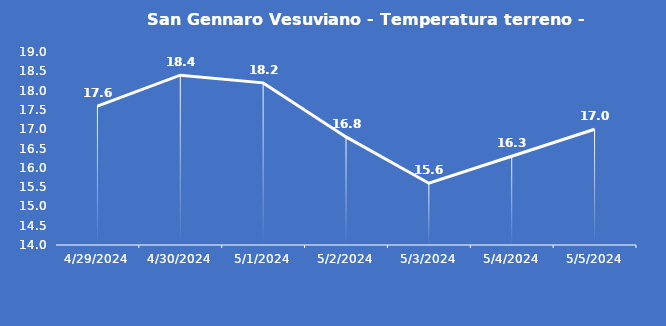
| Category | San Gennaro Vesuviano - Temperatura terreno - Grezzo (°C) |
|---|---|
| 4/29/24 | 17.6 |
| 4/30/24 | 18.4 |
| 5/1/24 | 18.2 |
| 5/2/24 | 16.8 |
| 5/3/24 | 15.6 |
| 5/4/24 | 16.3 |
| 5/5/24 | 17 |